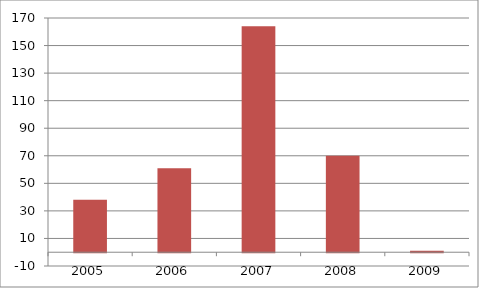
| Category | Series 1 |
|---|---|
| 0 | 38 |
| 1 | 61 |
| 2 | 164 |
| 3 | 70 |
| 4 | 1 |